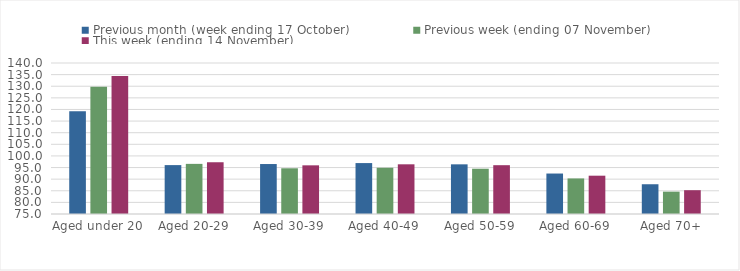
| Category | Previous month (week ending 17 October) | Previous week (ending 07 November) | This week (ending 14 November) |
|---|---|---|---|
| Aged under 20 | 119.27 | 129.82 | 134.42 |
| Aged 20-29 | 96.05 | 96.58 | 97.25 |
| Aged 30-39 | 96.51 | 94.68 | 95.95 |
| Aged 40-49 | 96.92 | 94.91 | 96.39 |
| Aged 50-59 | 96.38 | 94.49 | 96.01 |
| Aged 60-69 | 92.42 | 90.31 | 91.49 |
| Aged 70+ | 87.81 | 84.62 | 85.25 |